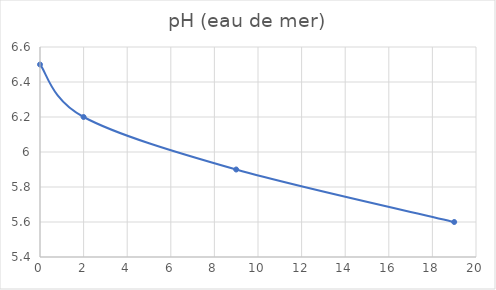
| Category | pH (eau de mer) |
|---|---|
| 0.0 | 6.5 |
| 2.0 | 6.2 |
| 9.0 | 5.9 |
| 19.0 | 5.6 |